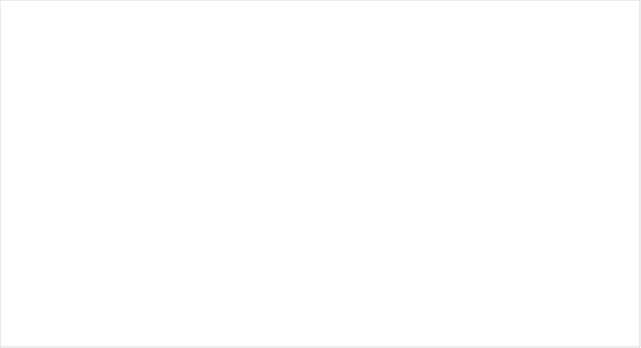
| Category | Material |
|---|---|
| P. Pesca | 0 |
| P. Consumo | 0 |
| P. Uso cotidiano | 0 |
| P. Particulado | 0 |
| Caucho | 0 |
| Tela | 0 |
| Papel y cartón | 0 |
| Madera | 0 |
| Metal | 0 |
| Vidrio | 0 |
| Cerámica | 0 |
| Sanitarios y médicos | 0 |
| Otros | 0 |